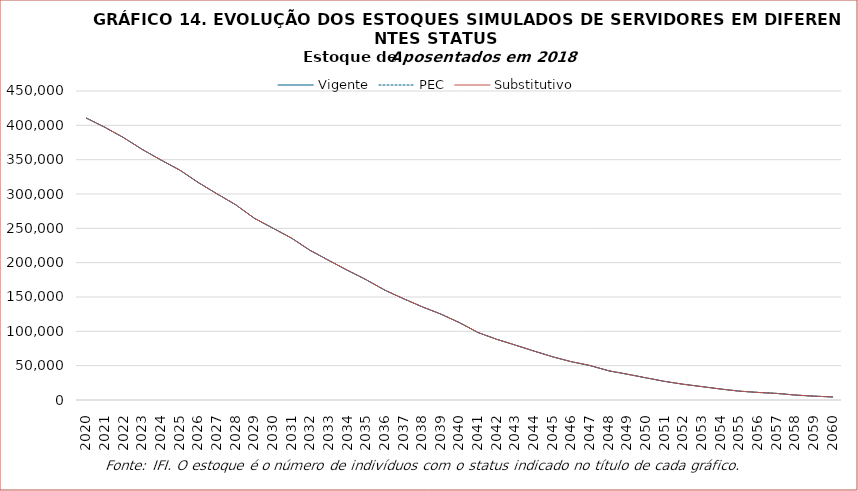
| Category | Vigente | PEC | Substitutivo |
|---|---|---|---|
| 2020.0 | 410569 | 410569 | 410569 |
| 2021.0 | 397057 | 397057 | 397057 |
| 2022.0 | 382073 | 382073 | 382073 |
| 2023.0 | 364814 | 364814 | 364814 |
| 2024.0 | 349504 | 349504 | 349504 |
| 2025.0 | 334971 | 334971 | 334971 |
| 2026.0 | 316720 | 316720 | 316720 |
| 2027.0 | 300267 | 300267 | 300267 |
| 2028.0 | 284437 | 284437 | 284437 |
| 2029.0 | 264714 | 264714 | 264714 |
| 2030.0 | 250261 | 250261 | 250261 |
| 2031.0 | 235673 | 235673 | 235673 |
| 2032.0 | 217832 | 217832 | 217832 |
| 2033.0 | 203213 | 203213 | 203213 |
| 2034.0 | 188815 | 188815 | 188815 |
| 2035.0 | 175111 | 175111 | 175111 |
| 2036.0 | 159959 | 159959 | 159959 |
| 2037.0 | 147510 | 147510 | 147510 |
| 2038.0 | 135749 | 135749 | 135749 |
| 2039.0 | 125126 | 125126 | 125126 |
| 2040.0 | 112620 | 112620 | 112620 |
| 2041.0 | 98179 | 98179 | 98179 |
| 2042.0 | 88355 | 88355 | 88355 |
| 2043.0 | 79902 | 79902 | 79902 |
| 2044.0 | 71201 | 71201 | 71201 |
| 2045.0 | 62844 | 62844 | 62844 |
| 2046.0 | 55740 | 55740 | 55740 |
| 2047.0 | 50178 | 50178 | 50178 |
| 2048.0 | 42515 | 42515 | 42515 |
| 2049.0 | 37525 | 37525 | 37525 |
| 2050.0 | 32265 | 32265 | 32265 |
| 2051.0 | 27097 | 27097 | 27097 |
| 2052.0 | 22897 | 22897 | 22897 |
| 2053.0 | 19464 | 19464 | 19464 |
| 2054.0 | 15956 | 15956 | 15956 |
| 2055.0 | 12890 | 12890 | 12890 |
| 2056.0 | 11026 | 11026 | 11026 |
| 2057.0 | 9566 | 9566 | 9566 |
| 2058.0 | 7223 | 7223 | 7223 |
| 2059.0 | 5583 | 5583 | 5583 |
| 2060.0 | 4456 | 4456 | 4456 |